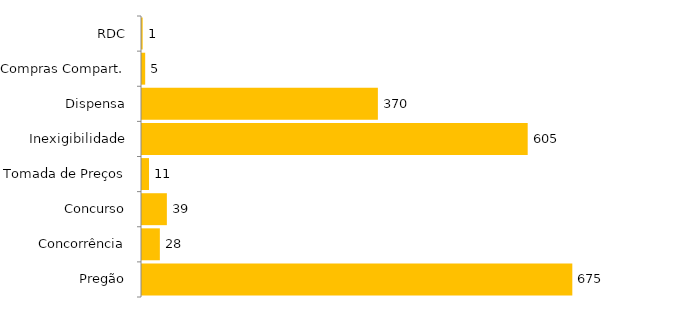
| Category | Total |
|---|---|
| Pregão | 675 |
| Concorrência | 28 |
| Concurso | 39 |
| Tomada de Preços | 11 |
| Inexigibilidade | 605 |
| Dispensa | 370 |
| Compras Compart. | 5 |
| RDC | 1 |